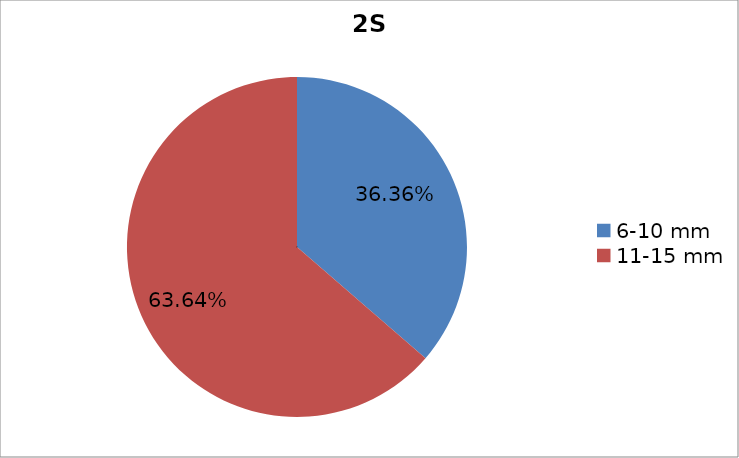
| Category | Series 0 |
|---|---|
| 6-10 mm | 0.364 |
| 11-15 mm | 0.636 |